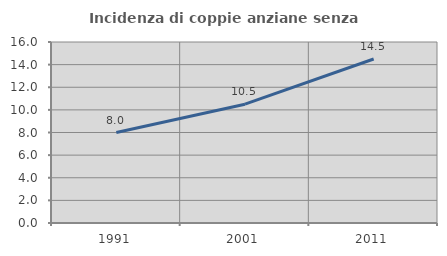
| Category | Incidenza di coppie anziane senza figli  |
|---|---|
| 1991.0 | 7.998 |
| 2001.0 | 10.503 |
| 2011.0 | 14.499 |